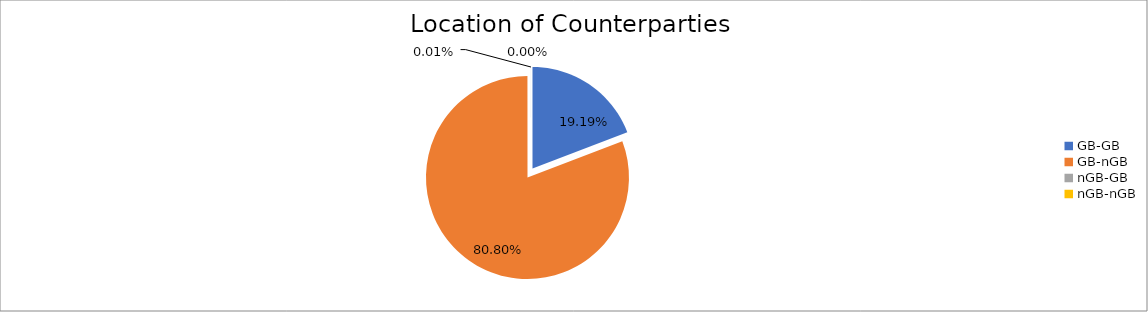
| Category | Series 0 |
|---|---|
| GB-GB | 1751320.66 |
| GB-nGB | 7374977.97 |
| nGB-GB | 624.799 |
| nGB-nGB | 239.533 |